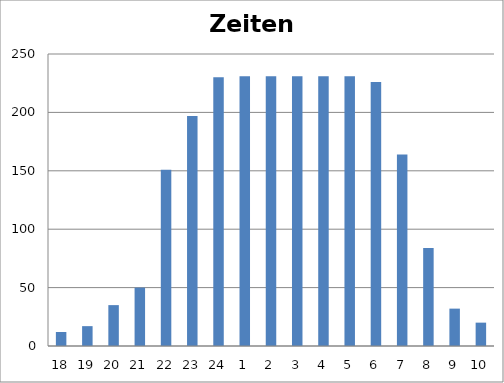
| Category | Series 1 |
|---|---|
| 18.0 | 12 |
| 19.0 | 17 |
| 20.0 | 35 |
| 21.0 | 50 |
| 22.0 | 151 |
| 23.0 | 197 |
| 24.0 | 230 |
| 1.0 | 231 |
| 2.0 | 231 |
| 3.0 | 231 |
| 4.0 | 231 |
| 5.0 | 231 |
| 6.0 | 226 |
| 7.0 | 164 |
| 8.0 | 84 |
| 9.0 | 32 |
| 10.0 | 20 |